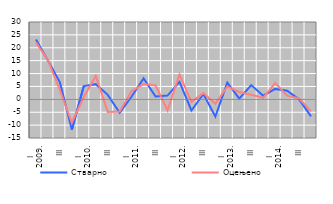
| Category | Стварно | Оцењено |
|---|---|---|
| I
2009. | 23.205 | 22.085 |
| II | 15.071 | 15.19 |
| III | 6.572 | 3.606 |
| IV | -11.843 | -9.004 |
| I
2010. | 5.136 | 0.915 |
| II | 5.886 | 9.032 |
| III | 1.744 | -4.868 |
| IV | -5.229 | -4.735 |
| I
2011. | 1.112 | 3.196 |
| II | 8.149 | 5.901 |
| III | 1.097 | 5.393 |
| IV | 1.444 | -4.232 |
| I
2012. | 6.745 | 9.619 |
| II | -4.323 | -0.975 |
| III | 2.056 | 2.426 |
| IV | -6.649 | -1.749 |
| I
2013. | 6.497 | 4.987 |
| II | 0.27 | 2.866 |
| III | 5.531 | 1.759 |
| IV | 1.427 | 0.595 |
| I
2014. | 4.051 | 6.297 |
| II | 3.36 | 1.444 |
| III | 0.005 | 0.316 |
| IV | -6.612 | -4.686 |